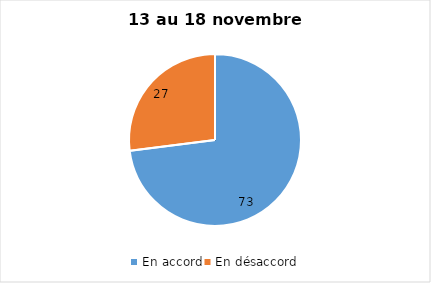
| Category | Series 0 |
|---|---|
| En accord | 73 |
| En désaccord | 27 |